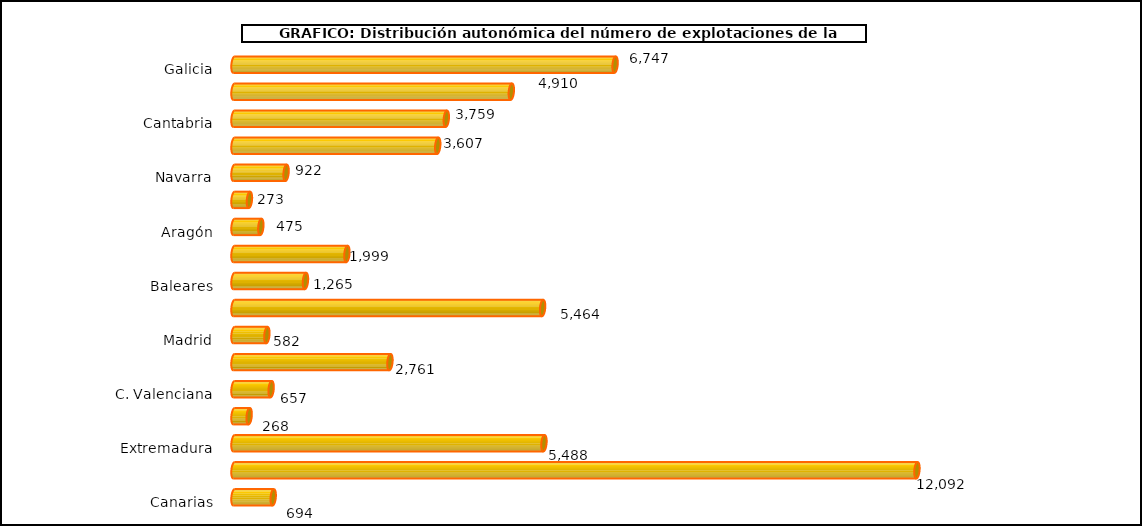
| Category | num. Explotaciones |
|---|---|
|   Galicia | 6747 |
|   P. de Asturias | 4910 |
|   Cantabria | 3759 |
|   País Vasco | 3607 |
|   Navarra | 922 |
|   La Rioja | 273 |
|   Aragón | 475 |
|   Cataluña | 1999 |
|   Baleares | 1265 |
|   Castilla y León | 5464 |
|   Madrid | 582 |
|   Castilla – La Mancha | 2761 |
|   C. Valenciana | 657 |
|   R. de Murcia | 268 |
|   Extremadura | 5488 |
|   Andalucía | 12092 |
|   Canarias | 694 |